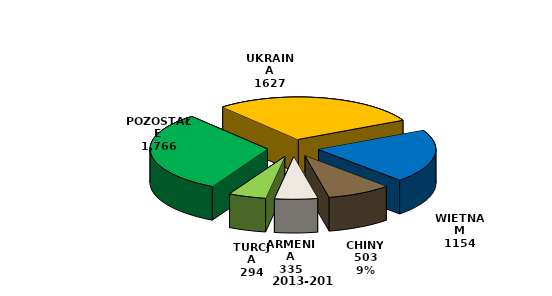
| Category | Series 0 |
|---|---|
| UKRAINA | 1627 |
| WIETNAM | 1154 |
| CHINY | 503 |
| ARMENIA | 335 |
| TURCJA | 294 |
| POZOSTAŁE | 1766 |